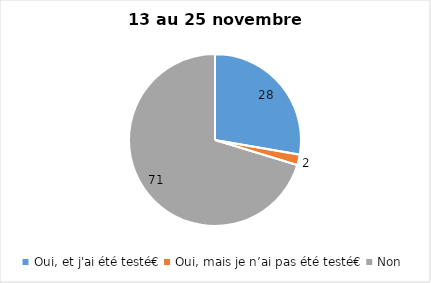
| Category | Series 0 |
|---|---|
| Oui, et j'ai été testé€ | 28 |
| Oui, mais je n’ai pas été testé€ | 2 |
| Non | 71 |